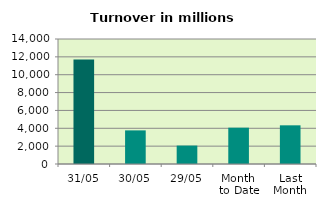
| Category | Series 0 |
|---|---|
| 31/05 | 11700.649 |
| 30/05 | 3764.975 |
| 29/05 | 2064.018 |
| Month 
to Date | 4067.502 |
| Last
Month | 4332.281 |